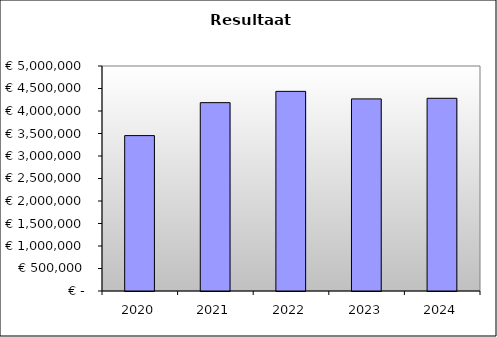
| Category | Series 0 |
|---|---|
| 2020.0 | 3453415.991 |
| 2021.0 | 4185426.834 |
| 2022.0 | 4436296.122 |
| 2023.0 | 4268750.634 |
| 2024.0 | 4282400.364 |